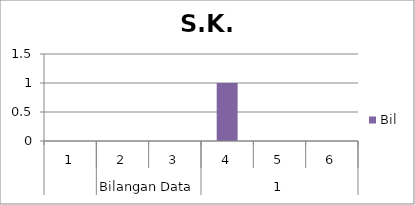
| Category | Bil |
|---|---|
| 0 | 0 |
| 1 | 0 |
| 2 | 0 |
| 3 | 1 |
| 4 | 0 |
| 5 | 0 |